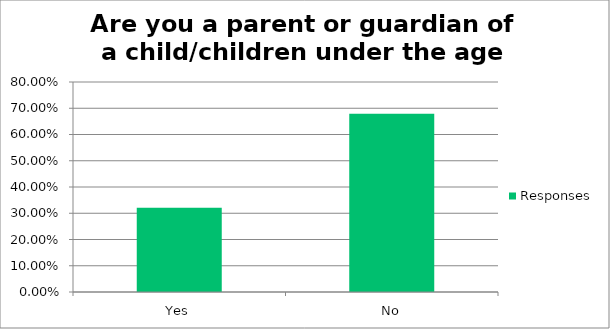
| Category | Responses |
|---|---|
| Yes | 0.321 |
| No | 0.679 |